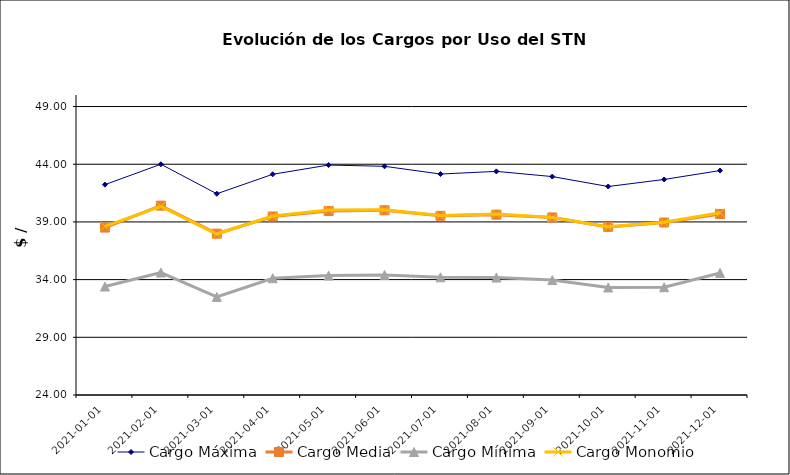
| Category | Cargo Máxima | Cargo Media | Cargo Mínima | Cargo Monomio |
|---|---|---|---|---|
| 2021-01-01 | 42.23 | 38.51 | 33.4 | 38.61 |
| 2021-02-01 | 44 | 40.41 | 34.61 | 40.35 |
| 2021-03-01 | 41.44 | 37.98 | 32.5 | 37.95 |
| 2021-04-01 | 43.13 | 39.47 | 34.12 | 39.51 |
| 2021-05-01 | 43.93 | 39.95 | 34.35 | 40.04 |
| 2021-06-01 | 43.82 | 40.01 | 34.41 | 40.05 |
| 2021-07-01 | 43.15 | 39.53 | 34.2 | 39.56 |
| 2021-08-01 | 43.38 | 39.63 | 34.18 | 39.68 |
| 2021-09-01 | 42.93 | 39.39 | 33.96 | 39.38 |
| 2021-10-01 | 42.07 | 38.57 | 33.32 | 38.58 |
| 2021-11-01 | 42.68 | 38.95 | 33.34 | 38.97 |
| 2021-12-01 | 43.45 | 39.69 | 34.58 | 39.79 |